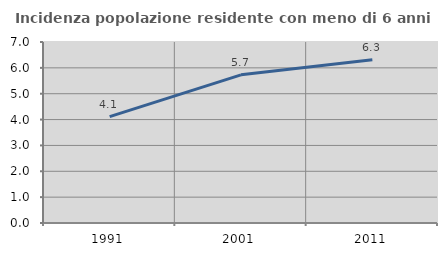
| Category | Incidenza popolazione residente con meno di 6 anni |
|---|---|
| 1991.0 | 4.116 |
| 2001.0 | 5.731 |
| 2011.0 | 6.311 |